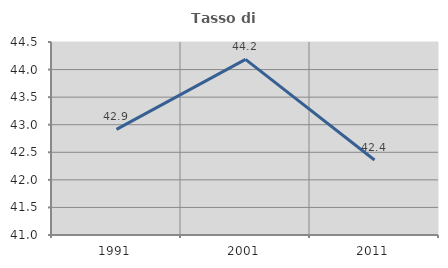
| Category | Tasso di occupazione   |
|---|---|
| 1991.0 | 42.915 |
| 2001.0 | 44.186 |
| 2011.0 | 42.359 |